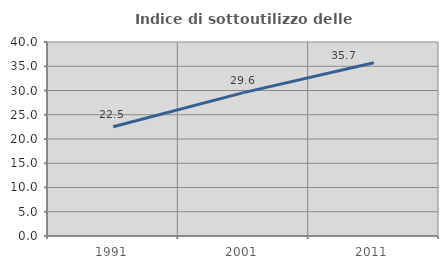
| Category | Indice di sottoutilizzo delle abitazioni  |
|---|---|
| 1991.0 | 22.535 |
| 2001.0 | 29.554 |
| 2011.0 | 35.724 |